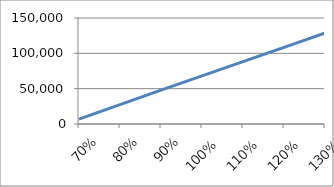
| Category | Series 0 |
|---|---|
| 0.7 | 6987.226 |
| 0.8 | 27499.105 |
| 0.9 | 47826.462 |
| 1.0 | 68097.938 |
| 1.1 | 88297.046 |
| 1.2 | 108517.127 |
| 1.3 | 128642.659 |